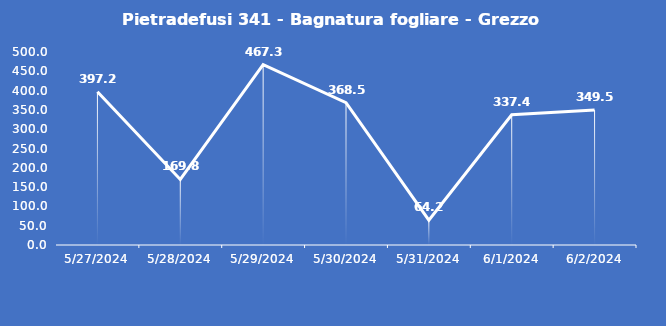
| Category | Pietradefusi 341 - Bagnatura fogliare - Grezzo (min) |
|---|---|
| 5/27/24 | 397.2 |
| 5/28/24 | 169.8 |
| 5/29/24 | 467.3 |
| 5/30/24 | 368.5 |
| 5/31/24 | 64.2 |
| 6/1/24 | 337.4 |
| 6/2/24 | 349.5 |